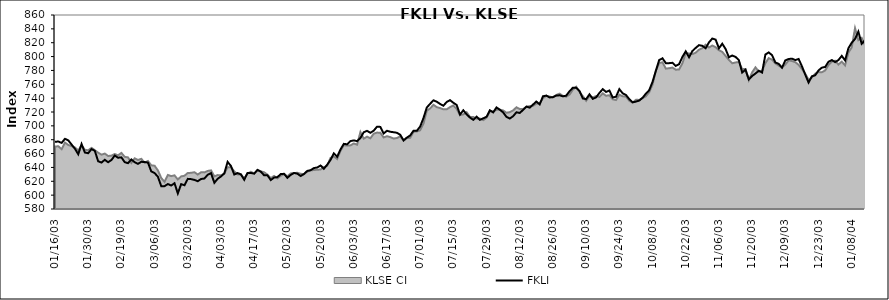
| Category | FKLI |
|---|---|
| 2003-01-16 | 677 |
| 2003-01-17 | 677.4 |
| 2003-01-20 | 675.4 |
| 2003-01-21 | 681.3 |
| 2003-01-22 | 679.1 |
| 2003-01-23 | 673 |
| 2003-01-24 | 667 |
| 2003-01-27 | 659 |
| 2003-01-28 | 673.8 |
| 2003-01-29 | 661.5 |
| 2003-01-30 | 660.5 |
| 2003-02-05 | 666.5 |
| 2003-02-06 | 663.9 |
| 2003-02-07 | 648.9 |
| 2003-02-10 | 647 |
| 2003-02-11 | 651 |
| 2003-02-13 | 647.5 |
| 2003-02-14 | 650.7 |
| 2003-02-17 | 657.2 |
| 2003-02-18 | 654 |
| 2003-02-19 | 654.5 |
| 2003-02-20 | 647.6 |
| 2003-02-21 | 646.1 |
| 2003-02-24 | 651.56 |
| 2003-02-25 | 647.5 |
| 2003-02-26 | 645.2 |
| 2003-02-27 | 648.1 |
| 2003-02-28 | 647.8 |
| 2003-03-03 | 647 |
| 2003-03-05 | 634.2 |
| 2003-03-06 | 631.9 |
| 2003-03-07 | 626.5 |
| 2003-03-10 | 613 |
| 2003-03-11 | 613 |
| 2003-03-12 | 616 |
| 2003-03-13 | 613.9 |
| 2003-03-14 | 617.2 |
| 2003-03-17 | 602.5 |
| 2003-03-18 | 615.9 |
| 2003-03-19 | 614.3 |
| 2003-03-20 | 623.5 |
| 2003-03-21 | 623.1 |
| 2003-03-24 | 622 |
| 2003-03-25 | 620.1 |
| 2003-03-26 | 623.3 |
| 2003-03-27 | 624 |
| 2003-03-28 | 629.4 |
| 2003-03-31 | 631.8 |
| 2003-04-01 | 617.8 |
| 2003-04-02 | 623.6 |
| 2003-04-03 | 627 |
| 2003-04-04 | 631.4 |
| 2003-04-07 | 648 |
| 2003-04-08 | 642.1 |
| 2003-04-09 | 629.8 |
| 2003-04-10 | 631.9 |
| 2003-04-11 | 630 |
| 2003-04-14 | 622.2 |
| 2003-04-15 | 632.1 |
| 2003-04-16 | 632 |
| 2003-04-17 | 631 |
| 2003-04-18 | 636.5 |
| 2003-04-21 | 633.9 |
| 2003-04-22 | 628.6 |
| 2003-04-23 | 628.6 |
| 2003-04-24 | 621.8 |
| 2003-04-25 | 625.4 |
| 2003-04-28 | 626 |
| 2003-04-29 | 630.4 |
| 2003-04-30 | 630.8 |
| 2003-05-02 | 625 |
| 2003-05-05 | 629.2 |
| 2003-05-06 | 632 |
| 2003-05-07 | 631 |
| 2003-05-08 | 627.6 |
| 2003-05-09 | 630.5 |
| 2003-05-12 | 635 |
| 2003-05-13 | 636 |
| 2003-05-16 | 639.1 |
| 2003-05-19 | 639.9 |
| 2003-05-20 | 642.8 |
| 2003-05-21 | 638.1 |
| 2003-05-22 | 644 |
| 2003-05-23 | 650.88 |
| 2003-05-26 | 660.3 |
| 2003-05-27 | 655.4 |
| 2003-05-28 | 666 |
| 2003-05-29 | 674 |
| 2003-05-30 | 673.4 |
| 2003-06-02 | 678 |
| 2003-06-03 | 679 |
| 2003-06-04 | 678 |
| 2003-06-05 | 682.43 |
| 2003-06-06 | 690.8 |
| 2003-06-09 | 692.8 |
| 2003-06-10 | 690 |
| 2003-06-11 | 693 |
| 2003-06-12 | 698.8 |
| 2003-06-13 | 698.5 |
| 2003-06-16 | 689 |
| 2003-06-17 | 692.9 |
| 2003-06-18 | 691.5 |
| 2003-06-19 | 690.8 |
| 2003-06-20 | 690 |
| 2003-06-23 | 687.1 |
| 2003-06-24 | 679 |
| 2003-06-25 | 683.1 |
| 2003-06-26 | 686.2 |
| 2003-06-27 | 693 |
| 2003-06-30 | 692.9 |
| 2003-07-01 | 699 |
| 2003-07-02 | 711.3 |
| 2003-07-03 | 726.5 |
| 2003-07-04 | 731.8 |
| 2003-07-07 | 736.9 |
| 2003-07-08 | 734.8 |
| 2003-07-09 | 731.6 |
| 2003-07-10 | 729.1 |
| 2003-07-11 | 734.5 |
| 2003-07-14 | 737.1 |
| 2003-07-15 | 733.3 |
| 2003-07-16 | 730.1 |
| 2003-07-17 | 716.3 |
| 2003-07-18 | 722.5 |
| 2003-07-21 | 716.6 |
| 2003-07-22 | 712 |
| 2003-07-23 | 708.7 |
| 2003-07-24 | 713.2 |
| 2003-07-25 | 708.7 |
| 2003-07-28 | 710.9 |
| 2003-07-29 | 713.1 |
| 2003-07-30 | 722.5 |
| 2003-07-31 | 719.4 |
| 2003-08-01 | 726.6 |
| 2003-08-04 | 723.3 |
| 2003-08-05 | 719.4 |
| 2003-08-06 | 713 |
| 2003-08-07 | 710.6 |
| 2003-08-08 | 713.9 |
| 2003-08-11 | 719.6 |
| 2003-08-12 | 718.6 |
| 2003-08-13 | 723 |
| 2003-08-14 | 727.8 |
| 2003-08-15 | 726.3 |
| 2003-08-18 | 730.7 |
| 2003-08-19 | 735.1 |
| 2003-08-20 | 731 |
| 2003-08-21 | 742.7 |
| 2003-08-22 | 743.7 |
| 2003-08-25 | 741 |
| 2003-08-26 | 741.5 |
| 2003-08-27 | 743.7 |
| 2003-08-28 | 744.1 |
| 2003-08-29 | 742.6 |
| 2003-09-02 | 743.6 |
| 2003-09-03 | 750 |
| 2003-09-04 | 755 |
| 2003-09-05 | 754.9 |
| 2003-09-08 | 750.4 |
| 2003-09-09 | 739.5 |
| 2003-09-10 | 738.6 |
| 2003-09-11 | 745.5 |
| 2003-09-12 | 739 |
| 2003-09-15 | 741.1 |
| 2003-09-16 | 747.5 |
| 2003-09-17 | 753 |
| 2003-09-18 | 749 |
| 2003-09-19 | 751 |
| 2003-09-22 | 741 |
| 2003-09-23 | 742 |
| 2003-09-24 | 753 |
| 2003-09-25 | 747 |
| 2003-09-26 | 744.5 |
| 2003-09-29 | 738.5 |
| 2003-09-30 | 734 |
| 2003-10-01 | 735 |
| 2003-10-02 | 736.5 |
| 2003-10-03 | 740.5 |
| 2003-10-06 | 746.5 |
| 2003-10-07 | 751.5 |
| 2003-10-08 | 763.5 |
| 2003-10-09 | 779.5 |
| 2003-10-10 | 795 |
| 2003-10-13 | 797.5 |
| 2003-10-14 | 790.5 |
| 2003-10-15 | 790.5 |
| 2003-10-16 | 791 |
| 2003-10-17 | 786.5 |
| 2003-10-20 | 789 |
| 2003-10-21 | 799.5 |
| 2003-10-22 | 807.5 |
| 2003-10-23 | 799 |
| 2003-10-27 | 808 |
| 2003-10-28 | 812.5 |
| 2003-10-29 | 816.5 |
| 2003-10-30 | 815.5 |
| 2003-10-31 | 812 |
| 2003-11-03 | 820.5 |
| 2003-11-04 | 826 |
| 2003-11-05 | 824.5 |
| 2003-11-06 | 812 |
| 2003-11-07 | 818.5 |
| 2003-11-10 | 811 |
| 2003-11-11 | 799 |
| 2003-11-12 | 801.5 |
| 2003-11-13 | 799.5 |
| 2003-11-14 | 795 |
| 2003-11-17 | 777 |
| 2003-11-18 | 781 |
| 2003-11-19 | 767 |
| 2003-11-20 | 772 |
| 2003-11-21 | 775.5 |
| 2003-11-27 | 779.5 |
| 2003-11-28 | 777 |
| 2003-12-01 | 803 |
| 2003-12-02 | 806 |
| 2003-12-03 | 802 |
| 2003-12-04 | 791.5 |
| 2003-12-05 | 789.5 |
| 2003-12-08 | 784 |
| 2003-12-09 | 794.5 |
| 2003-12-10 | 796.5 |
| 2003-12-11 | 797 |
| 2003-12-12 | 795 |
| 2003-12-15 | 796.5 |
| 2003-12-16 | 786 |
| 2003-12-17 | 774 |
| 2003-12-18 | 762.5 |
| 2003-12-19 | 771.5 |
| 2003-12-22 | 773 |
| 2003-12-23 | 780 |
| 2003-12-24 | 784 |
| 2003-12-26 | 785 |
| 2003-12-29 | 792.5 |
| 2003-12-30 | 795 |
| 2003-12-31 | 792 |
| 2004-01-02 | 795 |
| 2004-01-05 | 801 |
| 2004-01-06 | 794.5 |
| 2004-01-07 | 812 |
| 2004-01-08 | 820 |
| 2004-01-09 | 825.42 |
| 2004-01-12 | 836 |
| 2004-01-13 | 818.42 |
| 2004-01-14 | 823.5 |